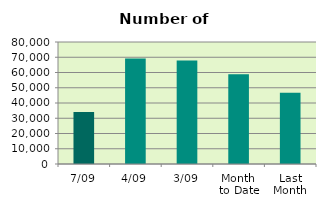
| Category | Series 0 |
|---|---|
| 7/09 | 34042 |
| 4/09 | 69150 |
| 3/09 | 67812 |
| Month 
to Date | 58849.2 |
| Last
Month | 46763.238 |